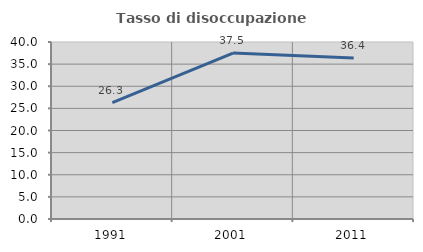
| Category | Tasso di disoccupazione giovanile  |
|---|---|
| 1991.0 | 26.316 |
| 2001.0 | 37.5 |
| 2011.0 | 36.364 |